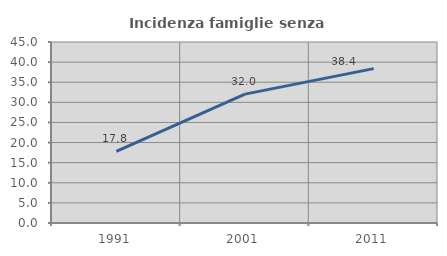
| Category | Incidenza famiglie senza nuclei |
|---|---|
| 1991.0 | 17.79 |
| 2001.0 | 32.045 |
| 2011.0 | 38.377 |